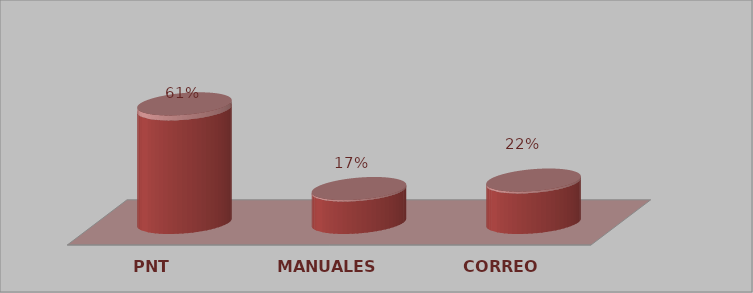
| Category | Series 0 | Series 1 |
|---|---|---|
| PNT | 14 | 0.609 |
| MANUALES | 4 | 0.174 |
| CORREO | 5 | 0.217 |